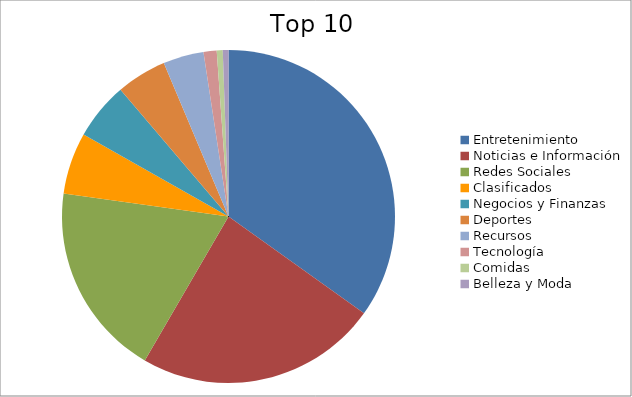
| Category | Series 0 |
|---|---|
| Entretenimiento | 34.22 |
| Noticias e Información | 23.06 |
| Redes Sociales | 18.46 |
| Clasificados | 5.88 |
| Negocios y Finanzas | 5.47 |
| Deportes | 4.79 |
| Recursos | 3.87 |
| Tecnología | 1.25 |
| Comidas | 0.57 |
| Belleza y Moda | 0.54 |